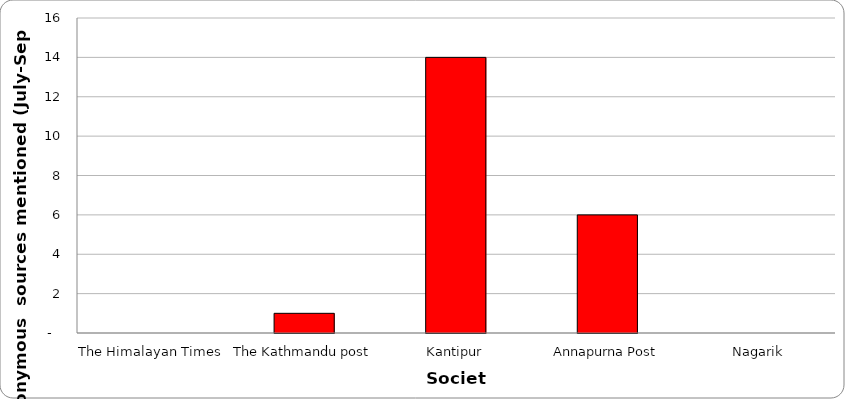
| Category | Society |
|---|---|
| The Himalayan Times | 0 |
| The Kathmandu post | 1 |
| Kantipur | 14 |
| Annapurna Post | 6 |
| Nagarik | 0 |